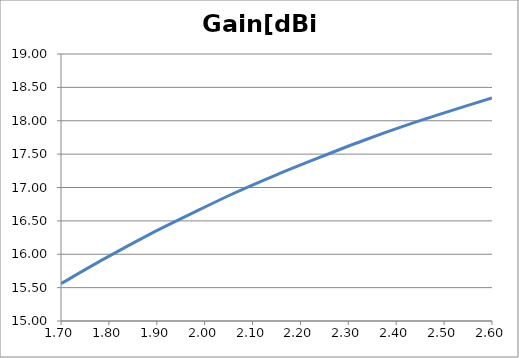
| Category | Gain[dBi] |
|---|---|
| 1.7 | 15.56 |
| 1.79 | 15.93 |
| 1.88 | 16.28 |
| 1.97 | 16.6 |
| 2.06 | 16.91 |
| 2.15 | 17.19 |
| 2.24 | 17.45 |
| 2.33 | 17.7 |
| 2.42 | 17.93 |
| 2.51 | 18.14 |
| 2.6 | 18.34 |